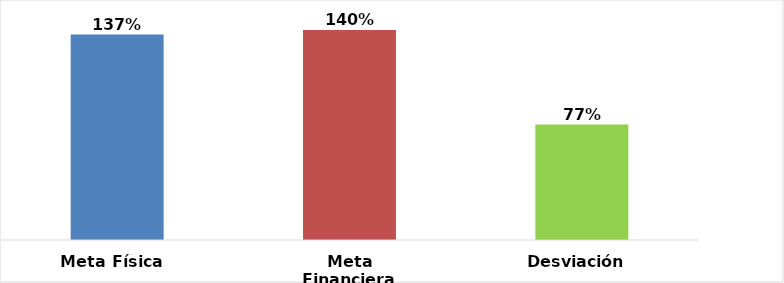
| Category | Meta Física  |
|---|---|
| Meta Física  | 1.37 |
| Meta Financiera | 1.4 |
| Desviación  | 0.77 |